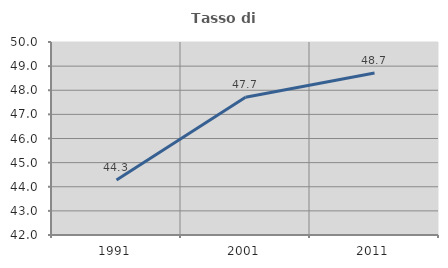
| Category | Tasso di occupazione   |
|---|---|
| 1991.0 | 44.284 |
| 2001.0 | 47.708 |
| 2011.0 | 48.718 |